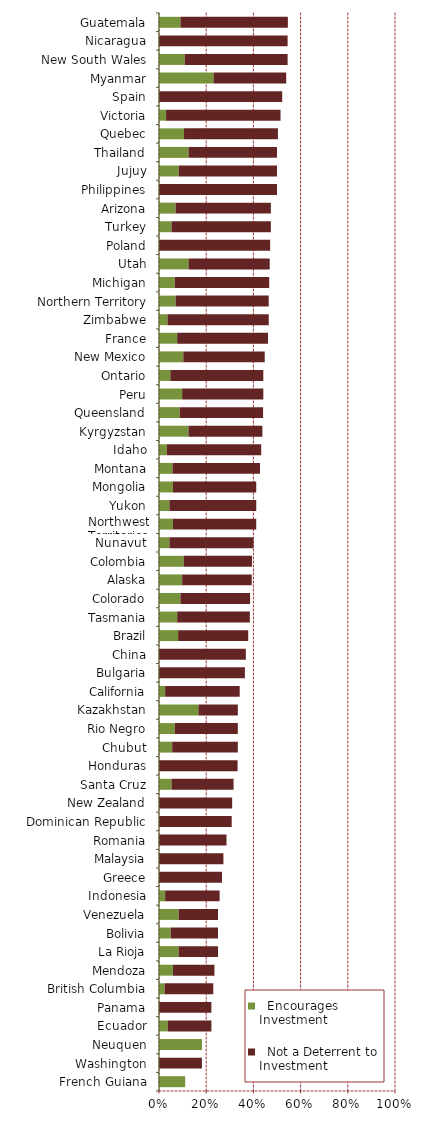
| Category |   Encourages Investment |   Not a Deterrent to Investment |
|---|---|---|
| French Guiana | 0.111 | 0 |
| Washington | 0 | 0.182 |
| Neuquen | 0.182 | 0 |
| Ecuador | 0.037 | 0.185 |
| Panama | 0 | 0.222 |
| British Columbia | 0.024 | 0.206 |
| Mendoza | 0.059 | 0.176 |
| La Rioja | 0.083 | 0.167 |
| Bolivia | 0.05 | 0.2 |
| Venezuela | 0.083 | 0.167 |
| Indonesia | 0.026 | 0.231 |
| Greece | 0 | 0.267 |
| Malaysia | 0 | 0.273 |
| Romania | 0 | 0.286 |
| Dominican Republic | 0 | 0.308 |
| New Zealand | 0 | 0.31 |
| Santa Cruz | 0.053 | 0.263 |
| Honduras | 0 | 0.333 |
| Chubut | 0.056 | 0.278 |
| Rio Negro | 0.067 | 0.267 |
| Kazakhstan | 0.167 | 0.167 |
| California | 0.026 | 0.316 |
| Bulgaria | 0 | 0.364 |
| China | 0 | 0.368 |
| Brazil | 0.081 | 0.297 |
| Tasmania | 0.077 | 0.308 |
| Colorado | 0.091 | 0.295 |
| Alaska | 0.098 | 0.295 |
| Colombia | 0.105 | 0.289 |
| Nunavut | 0.044 | 0.356 |
| Northwest Territories | 0.059 | 0.353 |
| Yukon | 0.044 | 0.368 |
| Mongolia | 0.059 | 0.353 |
| Montana | 0.057 | 0.371 |
| Idaho | 0.033 | 0.4 |
| Kyrgyzstan | 0.125 | 0.313 |
| Queensland | 0.088 | 0.353 |
| Peru | 0.098 | 0.344 |
| Ontario | 0.048 | 0.394 |
| New Mexico | 0.103 | 0.345 |
| France | 0.077 | 0.385 |
| Zimbabwe | 0.036 | 0.429 |
| Northern Territory | 0.07 | 0.395 |
| Michigan | 0.067 | 0.4 |
| Utah | 0.125 | 0.344 |
| Poland | 0 | 0.471 |
| Turkey | 0.053 | 0.421 |
| Arizona | 0.07 | 0.404 |
| Philippines | 0 | 0.5 |
| Jujuy | 0.083 | 0.417 |
| Thailand | 0.125 | 0.375 |
| Quebec | 0.106 | 0.398 |
| Victoria | 0.03 | 0.485 |
| Spain | 0 | 0.522 |
| Myanmar | 0.231 | 0.308 |
| New South Wales | 0.109 | 0.436 |
| Nicaragua | 0 | 0.545 |
| Guatemala | 0.091 | 0.455 |